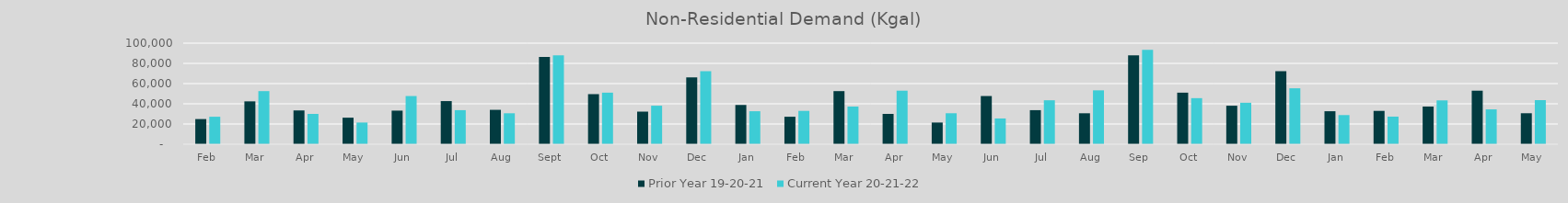
| Category | Prior Year 19-20-21 | Current Year 20-21-22 |
|---|---|---|
| Feb | 24891.705 | 27184.287 |
| Mar | 42416.796 | 52556.784 |
| Apr | 33427.881 | 30008.586 |
| May | 26254.448 | 21459.484 |
| Jun | 33248.873 | 47687.401 |
| Jul | 42679.938 | 33702.696 |
| Aug | 34036.498 | 30630.765 |
| Sep | 86367.775 | 87939.966 |
| Oct | 49561.754 | 51017.647 |
| Nov | 32261.42 | 38090.247 |
| Dec | 66164.871 | 72201.815 |
| Jan | 38851.995 | 32645.301 |
| Feb | 27184.287 | 32987.653 |
| Mar | 52556.784 | 37296.185 |
| Apr | 30008.586 | 52983.593 |
| May | 21459.484 | 30657.737 |
| Jun | 47687.401 | 25485.258 |
| Jul | 33702.696 | 43493.567 |
| Aug | 30630.765 | 53305.831 |
| Sep | 87939.966 | 93442.494 |
| Oct | 51017.647 | 45586.98 |
| Nov | 38090.247 | 41019.482 |
| Dec | 72201.815 | 55350.474 |
| Jan | 32645.301 | 28832.602 |
| Feb | 32987.653 | 27305.762 |
| Mar | 37296.185 | 43384.037 |
| Apr | 52983.593 | 34485.291 |
| May | 30657.737 | 43618.865 |